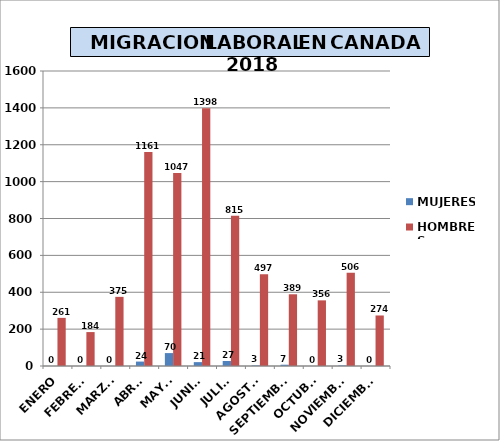
| Category | MUJERES | HOMBRES |
|---|---|---|
| ENERO | 0 | 261 |
| FEBRERO | 0 | 184 |
| MARZO | 0 | 375 |
| ABRIL | 24 | 1161 |
| MAYO | 70 | 1047 |
| JUNIO | 21 | 1398 |
| JULIO | 27 | 815 |
| AGOSTO | 3 | 497 |
| SEPTIEMBRE | 7 | 389 |
| OCTUBRE | 0 | 356 |
| NOVIEMBRE | 3 | 506 |
| DICIEMBRE | 0 | 274 |